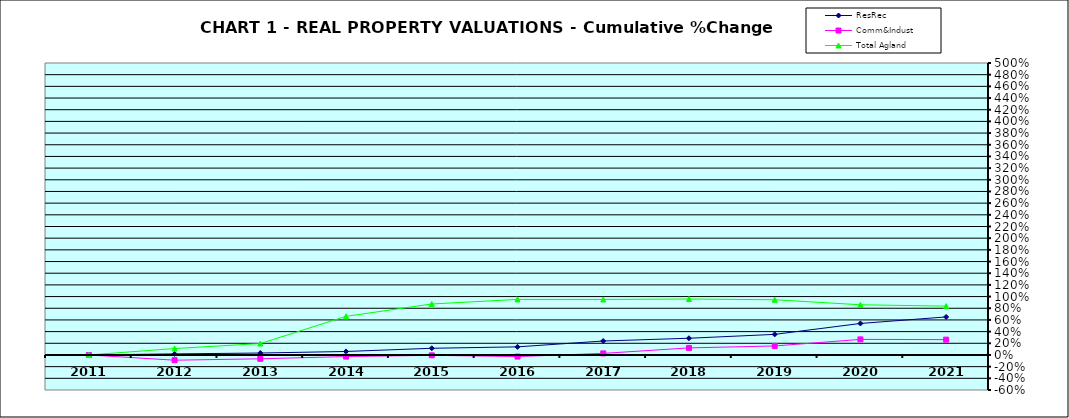
| Category | ResRec | Comm&Indust | Total Agland |
|---|---|---|---|
| 2011.0 | 0 | 0 | 0 |
| 2012.0 | 0.018 | -0.089 | 0.11 |
| 2013.0 | 0.033 | -0.066 | 0.196 |
| 2014.0 | 0.06 | -0.027 | 0.661 |
| 2015.0 | 0.115 | -0.006 | 0.873 |
| 2016.0 | 0.139 | -0.027 | 0.951 |
| 2017.0 | 0.239 | 0.027 | 0.951 |
| 2018.0 | 0.286 | 0.121 | 0.958 |
| 2019.0 | 0.352 | 0.154 | 0.946 |
| 2020.0 | 0.539 | 0.267 | 0.86 |
| 2021.0 | 0.651 | 0.262 | 0.836 |